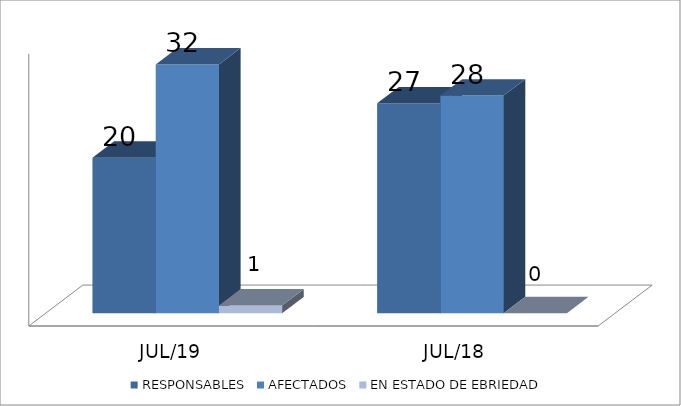
| Category | RESPONSABLES | AFECTADOS | EN ESTADO DE EBRIEDAD |
|---|---|---|---|
| JUL/19 | 20 | 32 | 1 |
| JUL/18 | 27 | 28 | 0 |